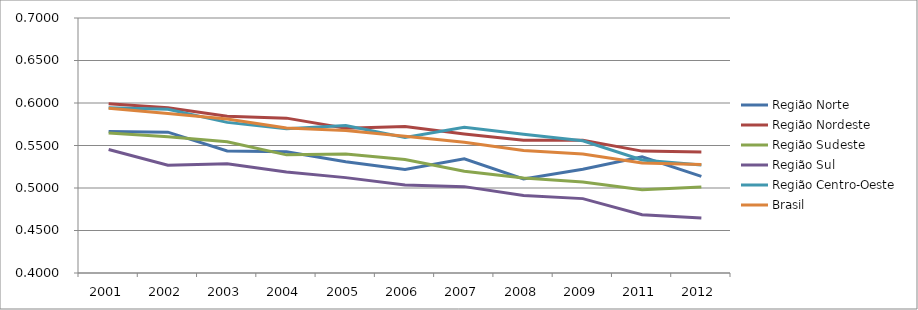
| Category | Região Norte | Região Nordeste | Região Sudeste | Região Sul | Região Centro-Oeste | Brasil |
|---|---|---|---|---|---|---|
| 2001.0 | 0.566 | 0.599 | 0.565 | 0.545 | 0.594 | 0.594 |
| 2002.0 | 0.566 | 0.594 | 0.56 | 0.527 | 0.593 | 0.588 |
| 2003.0 | 0.544 | 0.584 | 0.554 | 0.528 | 0.577 | 0.581 |
| 2004.0 | 0.543 | 0.582 | 0.539 | 0.519 | 0.57 | 0.57 |
| 2005.0 | 0.531 | 0.57 | 0.54 | 0.512 | 0.573 | 0.568 |
| 2006.0 | 0.522 | 0.572 | 0.534 | 0.503 | 0.559 | 0.561 |
| 2007.0 | 0.534 | 0.564 | 0.52 | 0.502 | 0.572 | 0.554 |
| 2008.0 | 0.511 | 0.556 | 0.512 | 0.491 | 0.563 | 0.544 |
| 2009.0 | 0.522 | 0.556 | 0.507 | 0.488 | 0.556 | 0.54 |
| 2011.0 | 0.537 | 0.543 | 0.498 | 0.468 | 0.533 | 0.529 |
| 2012.0 | 0.514 | 0.542 | 0.501 | 0.465 | 0.527 | 0.528 |